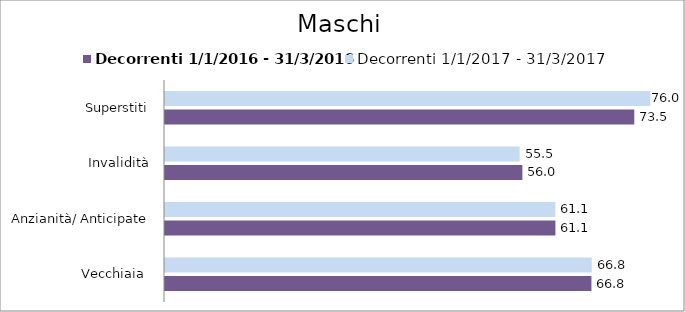
| Category | Decorrenti 1/1/2016 - 31/3/2016 | Decorrenti 1/1/2017 - 31/3/2017 |
|---|---|---|
| Vecchiaia  | 66.76 | 66.81 |
| Anzianità/ Anticipate | 61.12 | 61.11 |
| Invalidità | 55.95 | 55.52 |
| Superstiti | 73.47 | 75.99 |